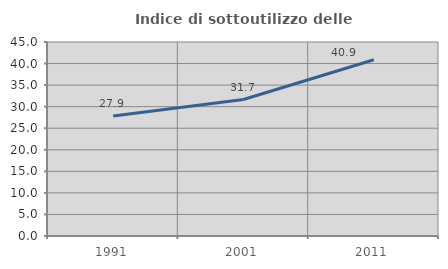
| Category | Indice di sottoutilizzo delle abitazioni  |
|---|---|
| 1991.0 | 27.855 |
| 2001.0 | 31.653 |
| 2011.0 | 40.896 |